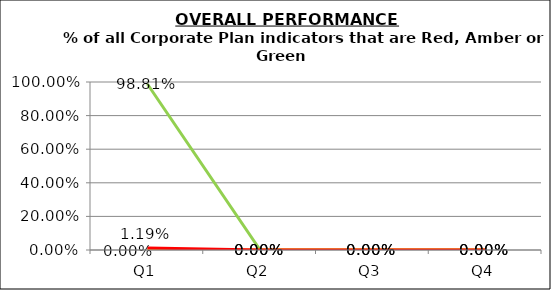
| Category | Green | Amber | Red |
|---|---|---|---|
| Q1 | 0.988 | 0 | 0.012 |
| Q2 | 0 | 0 | 0 |
| Q3 | 0 | 0 | 0 |
| Q4 | 0 | 0 | 0 |